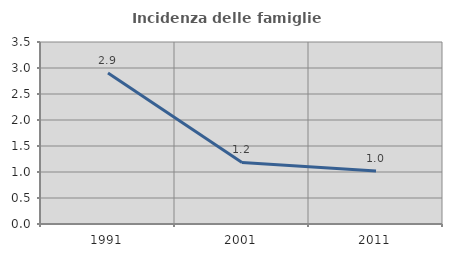
| Category | Incidenza delle famiglie numerose |
|---|---|
| 1991.0 | 2.906 |
| 2001.0 | 1.183 |
| 2011.0 | 1.021 |